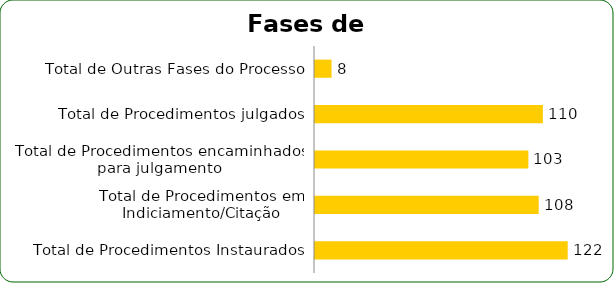
| Category | Series 0 |
|---|---|
| Total de Procedimentos Instaurados | 122 |
| Total de Procedimentos em Indiciamento/Citação | 108 |
| Total de Procedimentos encaminhados para julgamento | 103 |
| Total de Procedimentos julgados | 110 |
| Total de Outras Fases do Processo | 8 |